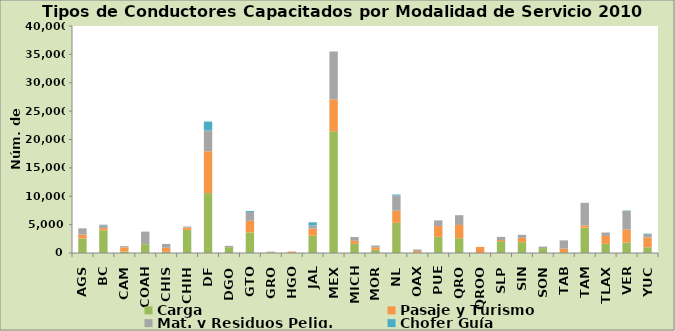
| Category | Carga | Pasaje y Turismo | Mat. y Residuos Pelig. | Chofer Guía |
|---|---|---|---|---|
| AGS | 2550 | 702 | 1092 | 0 |
| BC | 4004 | 370 | 521 | 88 |
| CAM | 260 | 734 | 203 | 12 |
| COAH | 1541 | 33 | 2194 | 0 |
| CHIS | 204 | 726 | 672 | 0 |
| CHIH | 4075 | 394 | 194 | 0 |
| DF | 10556 | 7365 | 3688 | 1543 |
| DGO | 1030 | 0 | 230 | 0 |
| GTO | 3629 | 2042 | 1542 | 192 |
| GRO | 121 | 54 | 36 | 20 |
| HGO | 0 | 248 | 8 | 0 |
| JAL | 3043 | 1247 | 563 | 558 |
| MEX | 21450 | 5614 | 8430 | 16 |
| MICH | 1614 | 535 | 673 | 0 |
| MOR | 558 | 457 | 244 | 51 |
| NL | 5313 | 2126 | 2699 | 169 |
| OAX | 121 | 244 | 256 | 0 |
| PUE | 2853 | 1897 | 1003 | 0 |
| QRO | 2604 | 2340 | 1717 | 0 |
| QROO | 0 | 1074 | 0 | 0 |
| SLP | 2094 | 196 | 551 | 0 |
| SIN | 1901 | 764 | 516 | 17 |
| SON | 871 | 0 | 257 | 0 |
| TAB | 144 | 620 | 1462 | 0 |
| TAM | 4476 | 388 | 3982 | 0 |
| TLAX | 1618 | 1392 | 595 | 0 |
| VER | 1850 | 2311 | 3244 | 77 |
| YUC | 1016 | 1721 | 592 | 84 |